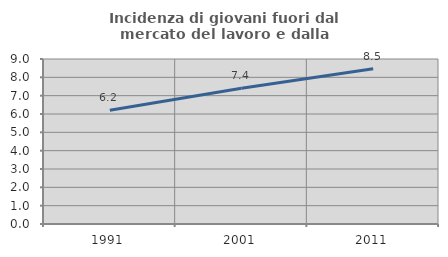
| Category | Incidenza di giovani fuori dal mercato del lavoro e dalla formazione  |
|---|---|
| 1991.0 | 6.207 |
| 2001.0 | 7.403 |
| 2011.0 | 8.472 |